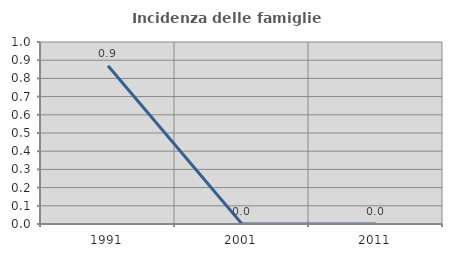
| Category | Incidenza delle famiglie numerose |
|---|---|
| 1991.0 | 0.87 |
| 2001.0 | 0 |
| 2011.0 | 0 |